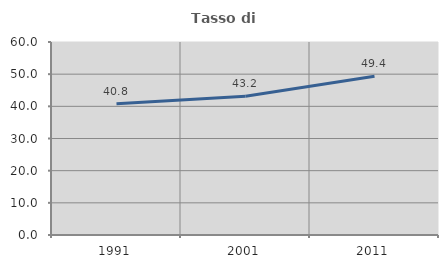
| Category | Tasso di occupazione   |
|---|---|
| 1991.0 | 40.825 |
| 2001.0 | 43.161 |
| 2011.0 | 49.364 |